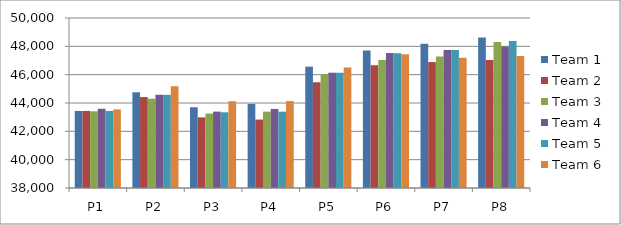
| Category | Team 1 | Team 2 | Team 3 | Team 4 | Team 5 | Team 6 |
|---|---|---|---|---|---|---|
| P1 | 43438 | 43438 | 43414 | 43594 | 43438 | 43548 |
| P2 | 44763 | 44418 | 44299 | 44578 | 44578 | 45180 |
| P3 | 43700 | 42987 | 43254 | 43391 | 43345 | 44126 |
| P4 | 43938 | 42830 | 43389 | 43581 | 43389 | 44135 |
| P5 | 46567 | 45457 | 46031 | 46138 | 46129 | 46505 |
| P6 | 47699 | 46666 | 47037 | 47526 | 47516 | 47445 |
| P7 | 48187 | 46890 | 47291 | 47748 | 47738 | 47190 |
| P8 | 48626 | 47039 | 48311 | 47985 | 48376 | 47312 |